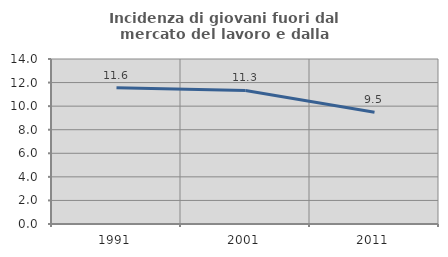
| Category | Incidenza di giovani fuori dal mercato del lavoro e dalla formazione  |
|---|---|
| 1991.0 | 11.569 |
| 2001.0 | 11.331 |
| 2011.0 | 9.485 |